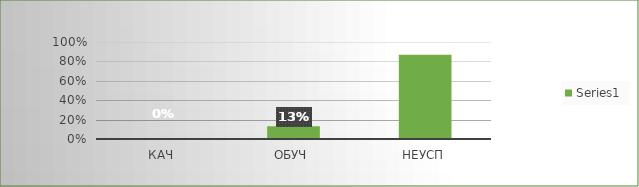
| Category | Series 0 |
|---|---|
| кач | 0 |
| обуч | 0.13 |
| неусп | 0.87 |